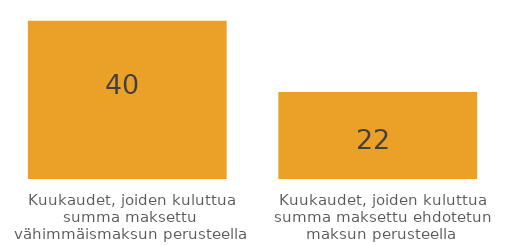
| Category | Series 0 |
|---|---|
| Kuukaudet, joiden kuluttua summa maksettu vähimmäismaksun perusteella | 40 |
| Kuukaudet, joiden kuluttua summa maksettu ehdotetun maksun perusteella | 22 |